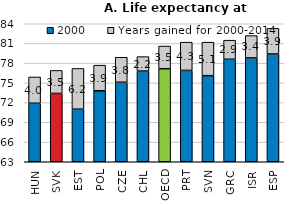
| Category | 2000 | Years gained for 2000-2014 |
|---|---|---|
| HUN | 71.9 | 4 |
| SVK | 73.4 | 3.5 |
| EST | 71 | 6.2 |
| POL | 73.8 | 3.9 |
| CZE | 75.1 | 3.8 |
| CHL | 76.8 | 2.2 |
| OECD | 77.159 | 3.45 |
| PRT | 76.9 | 4.3 |
| SVN | 76.1 | 5.1 |
| GRC | 78.6 | 2.9 |
| ISR | 78.8 | 3.4 |
| ESP | 79.4 | 3.9 |